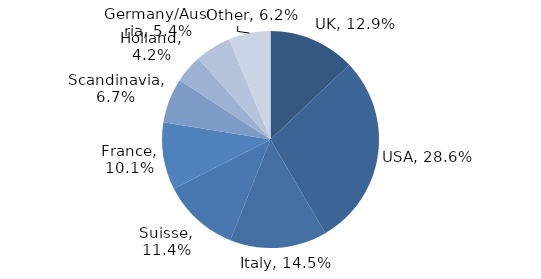
| Category | Investment Style |
|---|---|
| UK | 0.129 |
| USA | 0.286 |
| Italy | 0.145 |
| Suisse | 0.114 |
| France | 0.101 |
| Scandinavia | 0.067 |
| Holland | 0.042 |
| Germany/Austria | 0.054 |
| Other | 0.062 |